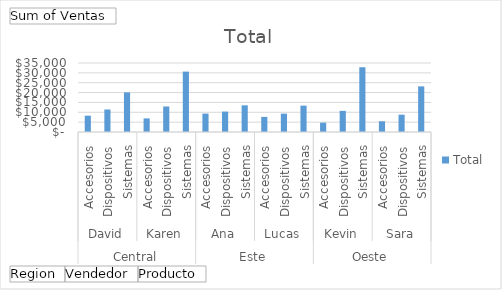
| Category | Total |
|---|---|
| 0 | 8287 |
| 1 | 11420 |
| 2 | 20098 |
| 3 | 6909 |
| 4 | 12948 |
| 5 | 30633 |
| 6 | 9323 |
| 7 | 10348 |
| 8 | 13531 |
| 9 | 7667 |
| 10 | 9312 |
| 11 | 13374 |
| 12 | 4744 |
| 13 | 10711 |
| 14 | 32855 |
| 15 | 5442 |
| 16 | 8780 |
| 17 | 23151 |